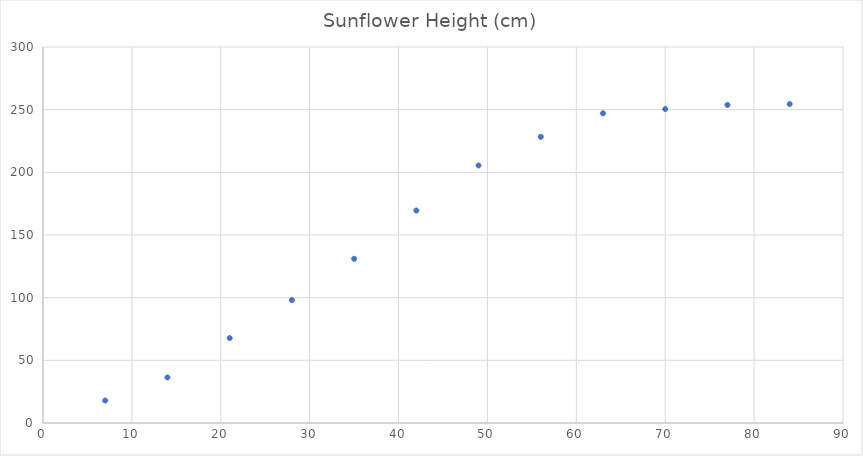
| Category | Height (cm) |
|---|---|
| 7.0 | 17.93 |
| 14.0 | 36.36 |
| 21.0 | 67.76 |
| 28.0 | 98.1 |
| 35.0 | 131 |
| 42.0 | 169.5 |
| 49.0 | 205.5 |
| 56.0 | 228.3 |
| 63.0 | 247.1 |
| 70.0 | 250.5 |
| 77.0 | 253.8 |
| 84.0 | 254.5 |